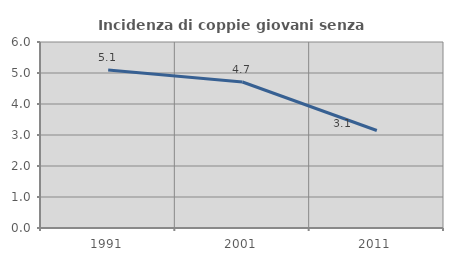
| Category | Incidenza di coppie giovani senza figli |
|---|---|
| 1991.0 | 5.098 |
| 2001.0 | 4.71 |
| 2011.0 | 3.145 |